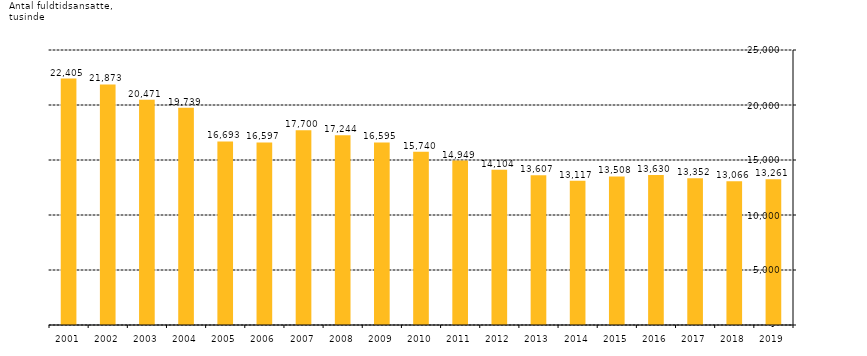
| Category | Series 0 |
|---|---|
| 2019.0 | 13261 |
| 2018.0 | 13066 |
| 2017.0 | 13352 |
| 2016.0 | 13630 |
| 2015.0 | 13508 |
| 2014.0 | 13117 |
| 2013.0 | 13607 |
| 2012.0 | 14104 |
| 2011.0 | 14949 |
| 2010.0 | 15740 |
| 2009.0 | 16595 |
| 2008.0 | 17244 |
| 2007.0 | 17700 |
| 2006.0 | 16597 |
| 2005.0 | 16693 |
| 2004.0 | 19739 |
| 2003.0 | 20471 |
| 2002.0 | 21873 |
| 2001.0 | 22405 |